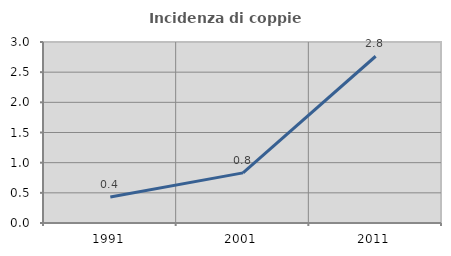
| Category | Incidenza di coppie miste |
|---|---|
| 1991.0 | 0.431 |
| 2001.0 | 0.831 |
| 2011.0 | 2.764 |